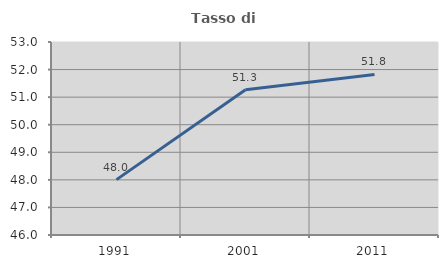
| Category | Tasso di occupazione   |
|---|---|
| 1991.0 | 48.009 |
| 2001.0 | 51.27 |
| 2011.0 | 51.825 |